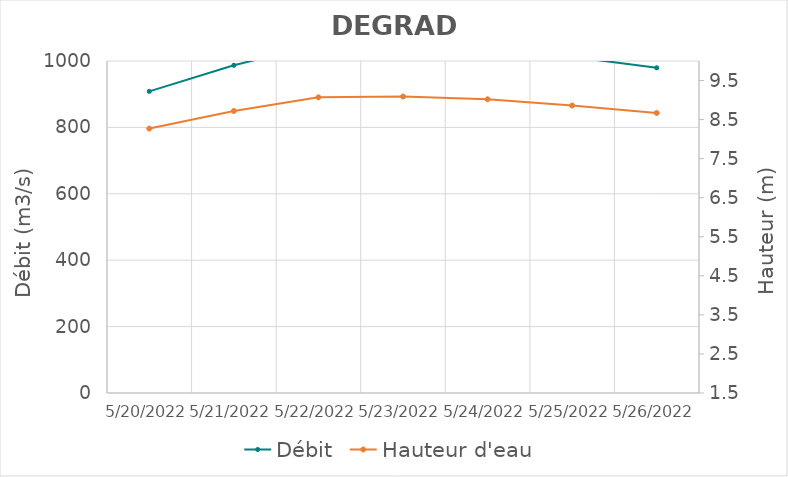
| Category | Débit |
|---|---|
| 4/26/22 | 772.27 |
| 4/25/22 | 760.98 |
| 4/24/22 | 723 |
| 4/23/22 | 658.5 |
| 4/22/22 | 589.73 |
| 4/21/22 | 524.85 |
| 4/20/22 | 493.58 |